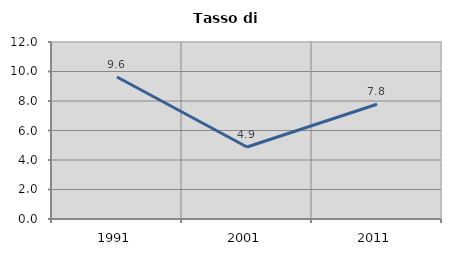
| Category | Tasso di disoccupazione   |
|---|---|
| 1991.0 | 9.629 |
| 2001.0 | 4.878 |
| 2011.0 | 7.782 |